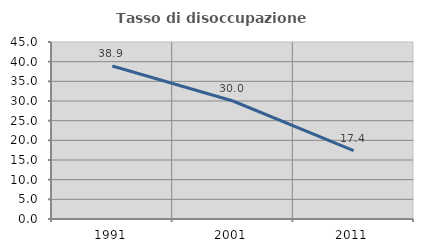
| Category | Tasso di disoccupazione giovanile  |
|---|---|
| 1991.0 | 38.889 |
| 2001.0 | 30 |
| 2011.0 | 17.391 |